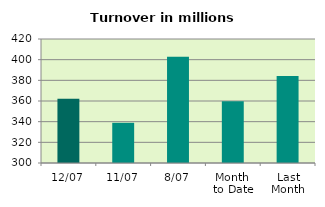
| Category | Series 0 |
|---|---|
| 12/07 | 362.22 |
| 11/07 | 338.896 |
| 8/07 | 402.789 |
| Month 
to Date | 359.861 |
| Last
Month | 384.158 |